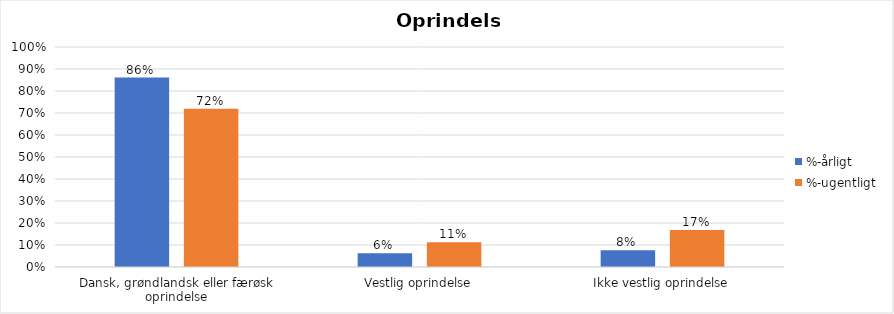
| Category | %-årligt | %-ugentligt |
|---|---|---|
| Dansk, grøndlandsk eller færøsk oprindelse | 0.861 | 0.719 |
| Vestlig oprindelse | 0.063 | 0.112 |
| Ikke vestlig oprindelse | 0.076 | 0.168 |